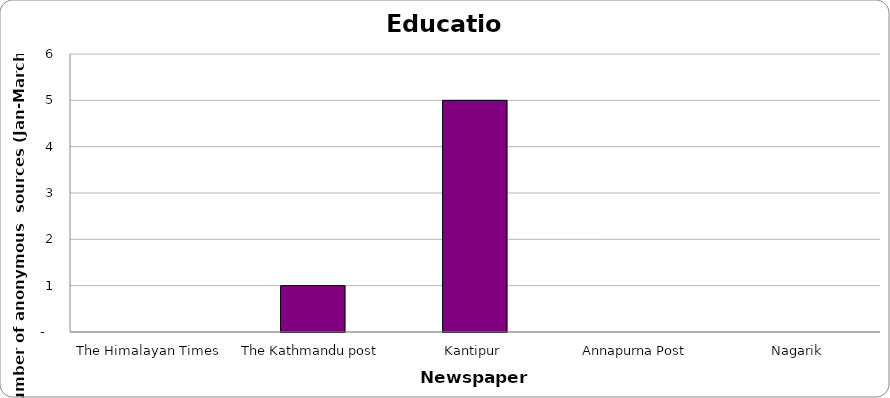
| Category | Education |
|---|---|
| The Himalayan Times | 0 |
| The Kathmandu post | 1 |
| Kantipur | 5 |
| Annapurna Post | 0 |
| Nagarik | 0 |